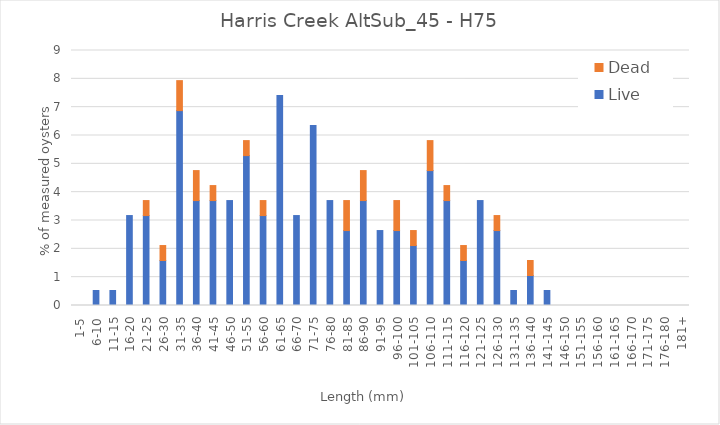
| Category | Live | Dead |
|---|---|---|
| 1-5 | 0 | 0 |
| 6-10 | 0.529 | 0 |
| 11-15 | 0.529 | 0 |
| 16-20 | 3.175 | 0 |
| 21-25 | 3.175 | 0.529 |
| 26-30 | 1.587 | 0.529 |
| 31-35 | 6.878 | 1.058 |
| 36-40 | 3.704 | 1.058 |
| 41-45 | 3.704 | 0.529 |
| 46-50 | 3.704 | 0 |
| 51-55 | 5.291 | 0.529 |
| 56-60 | 3.175 | 0.529 |
| 61-65 | 7.407 | 0 |
| 66-70 | 3.175 | 0 |
| 71-75 | 6.349 | 0 |
| 76-80 | 3.704 | 0 |
| 81-85 | 2.646 | 1.058 |
| 86-90 | 3.704 | 1.058 |
| 91-95 | 2.646 | 0 |
| 96-100 | 2.646 | 1.058 |
| 101-105 | 2.116 | 0.529 |
| 106-110 | 4.762 | 1.058 |
| 111-115 | 3.704 | 0.529 |
| 116-120 | 1.587 | 0.529 |
| 121-125 | 3.704 | 0 |
| 126-130 | 2.646 | 0.529 |
| 131-135 | 0.529 | 0 |
| 136-140 | 1.058 | 0.529 |
| 141-145 | 0.529 | 0 |
| 146-150 | 0 | 0 |
| 151-155 | 0 | 0 |
| 156-160 | 0 | 0 |
| 161-165 | 0 | 0 |
| 166-170 | 0 | 0 |
| 171-175 | 0 | 0 |
| 176-180 | 0 | 0 |
| 181+ | 0 | 0 |